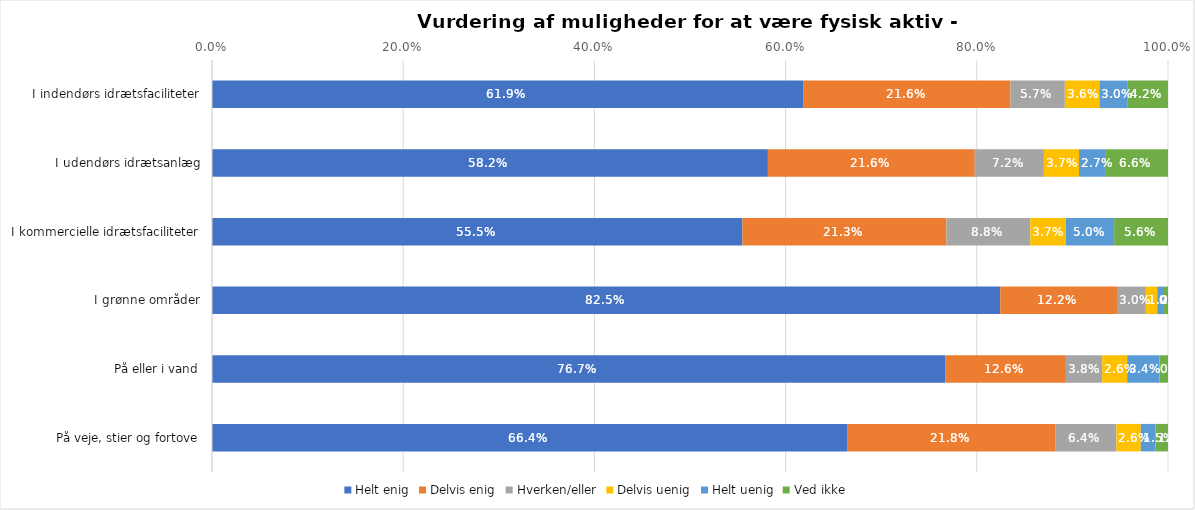
| Category | Helt enig | Delvis enig | Hverken/eller | Delvis uenig | Helt uenig | Ved ikke |
|---|---|---|---|---|---|---|
| I indendørs idrætsfaciliteter | 0.619 | 0.216 | 0.057 | 0.036 | 0.03 | 0.042 |
| I udendørs idrætsanlæg | 0.582 | 0.216 | 0.072 | 0.037 | 0.027 | 0.066 |
| I kommercielle idrætsfaciliteter | 0.555 | 0.213 | 0.088 | 0.037 | 0.05 | 0.056 |
| I grønne områder | 0.825 | 0.122 | 0.03 | 0.012 | 0.007 | 0.004 |
| På eller i vand | 0.767 | 0.126 | 0.038 | 0.026 | 0.034 | 0.009 |
| På veje, stier og fortove | 0.664 | 0.218 | 0.064 | 0.026 | 0.015 | 0.013 |